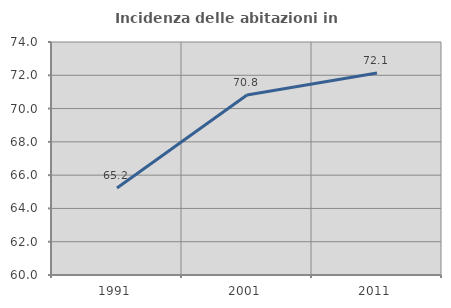
| Category | Incidenza delle abitazioni in proprietà  |
|---|---|
| 1991.0 | 65.232 |
| 2001.0 | 70.815 |
| 2011.0 | 72.132 |